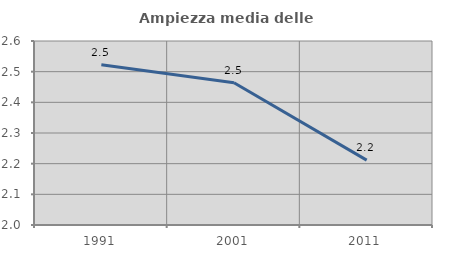
| Category | Ampiezza media delle famiglie |
|---|---|
| 1991.0 | 2.522 |
| 2001.0 | 2.464 |
| 2011.0 | 2.211 |